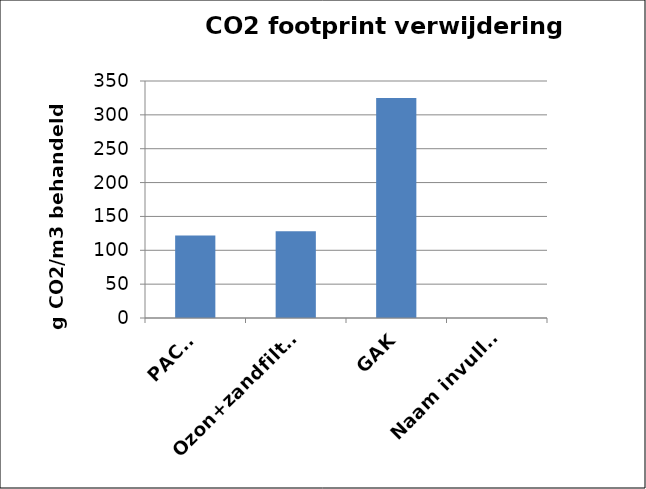
| Category | g CO2/m3 |
|---|---|
| PACAS | 121.705 |
| Ozon+zandfiltratie | 128.169 |
| GAK | 324.943 |
| Naam invullen | 0 |